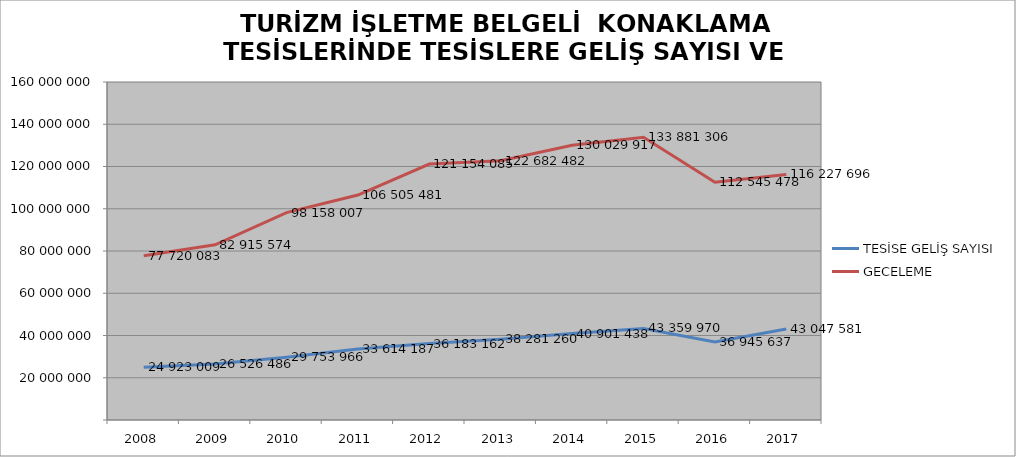
| Category | TESİSE GELİŞ SAYISI | GECELEME |
|---|---|---|
| 2008 | 24923009 | 77720083 |
| 2009 | 26526486 | 82915574 |
| 2010 | 29753966 | 98158007 |
| 2011 | 33614187 | 106505481 |
| 2012 | 36183162 | 121154085 |
| 2013 | 38281260 | 122682482 |
| 2014 | 40901438 | 130029917 |
| 2015 | 43359970 | 133881306 |
| 2016 | 36945637 | 112545478 |
| 2017 | 43047581 | 116227696 |